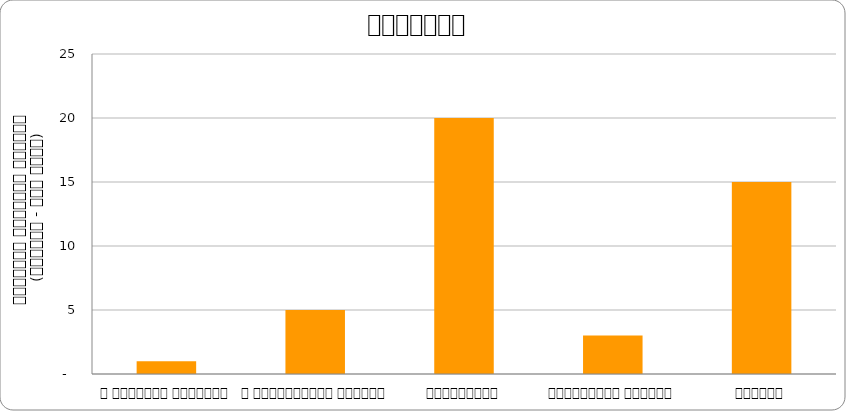
| Category | सुरक्षा |
|---|---|
| द हिमालयन टाइम्स् | 1 |
| द काठमाण्डौं पोस्ट् | 5 |
| कान्तिपुर | 20 |
| अन्नपूर्ण पोस्ट् | 3 |
| नागरिक | 15 |